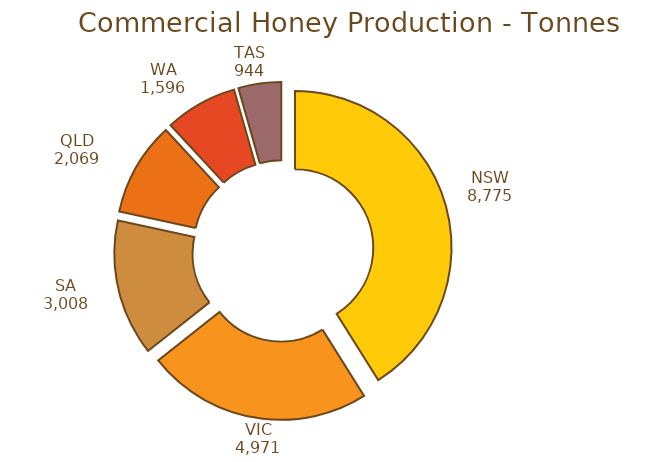
| Category | Tonnes |
|---|---|
| NSW | 8775 |
| VIC | 4971 |
| SA | 3008 |
| QLD | 2069 |
| WA | 1596 |
| TAS | 944 |